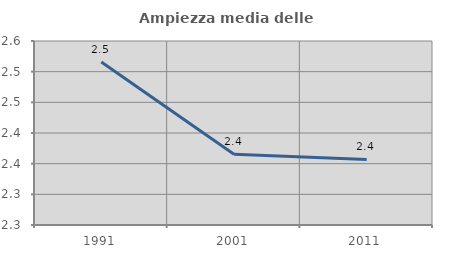
| Category | Ampiezza media delle famiglie |
|---|---|
| 1991.0 | 2.516 |
| 2001.0 | 2.365 |
| 2011.0 | 2.357 |